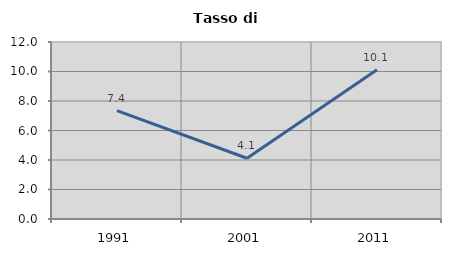
| Category | Tasso di disoccupazione   |
|---|---|
| 1991.0 | 7.353 |
| 2001.0 | 4.12 |
| 2011.0 | 10.114 |